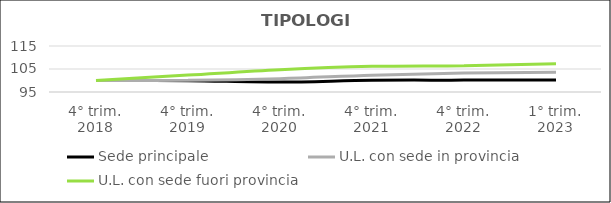
| Category | Sede principale | U.L. con sede in provincia | U.L. con sede fuori provincia |
|---|---|---|---|
| 4° trim.
2018 | 100 | 100 | 100 |
| 4° trim.
2019 | 99.901 | 100.082 | 102.344 |
| 4° trim.
2020 | 99.334 | 100.807 | 104.709 |
| 4° trim.
2021 | 100.09 | 102.324 | 106.153 |
| 4° trim.
2022 | 100.163 | 103.268 | 106.467 |
| 1° trim.
2023 | 100.267 | 103.541 | 107.283 |